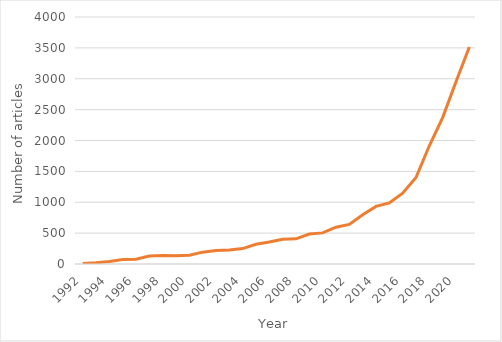
| Category | No. |
|---|---|
| 1992.0 | 9 |
| 1993.0 | 22 |
| 1994.0 | 42 |
| 1995.0 | 73 |
| 1996.0 | 76 |
| 1997.0 | 130 |
| 1998.0 | 139 |
| 1999.0 | 135 |
| 2000.0 | 143 |
| 2001.0 | 192 |
| 2002.0 | 220 |
| 2003.0 | 225 |
| 2004.0 | 250 |
| 2005.0 | 320 |
| 2006.0 | 357 |
| 2007.0 | 402 |
| 2008.0 | 407 |
| 2009.0 | 485 |
| 2010.0 | 504 |
| 2011.0 | 596 |
| 2012.0 | 642 |
| 2013.0 | 796 |
| 2014.0 | 933 |
| 2015.0 | 988 |
| 2016.0 | 1146 |
| 2017.0 | 1401 |
| 2018.0 | 1915 |
| 2019.0 | 2371 |
| 2020.0 | 2952 |
| 2021.0 | 3514 |